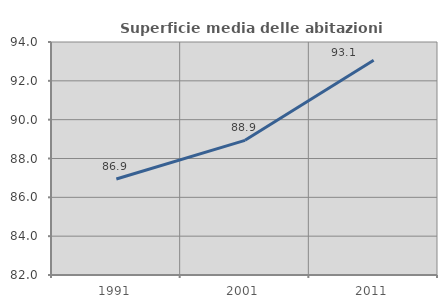
| Category | Superficie media delle abitazioni occupate |
|---|---|
| 1991.0 | 86.944 |
| 2001.0 | 88.936 |
| 2011.0 | 93.057 |